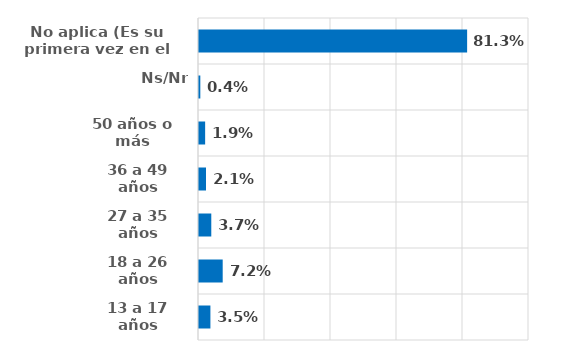
| Category | Series 0 |
|---|---|
| 13 a 17 años | 0.035 |
| 18 a 26 años | 0.072 |
| 27 a 35 años | 0.037 |
| 36 a 49 años | 0.021 |
| 50 años o más | 0.019 |
| Ns/Nr | 0.004 |
| No aplica (Es su primera vez en el Festival) | 0.812 |